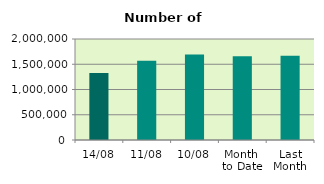
| Category | Series 0 |
|---|---|
| 14/08 | 1324934 |
| 11/08 | 1569268 |
| 10/08 | 1693114 |
| Month 
to Date | 1660609.2 |
| Last
Month | 1667155.619 |